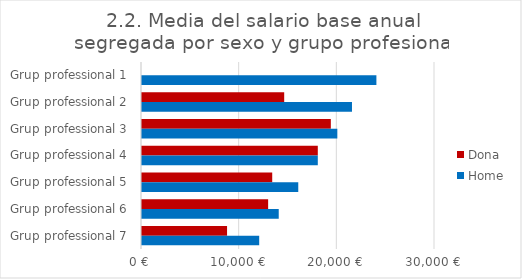
| Category | Dona | Home |
|---|---|---|
| Grup professional 1 | 0 | 24000 |
| Grup professional 2 | 14559 | 21500 |
| Grup professional 3 | 19334 | 20000 |
| Grup professional 4 | 18000 | 18000 |
| Grup professional 5 | 13333.333 | 16000 |
| Grup professional 6 | 12915.395 | 14000 |
| Grup professional 7 | 8708.5 | 12000 |